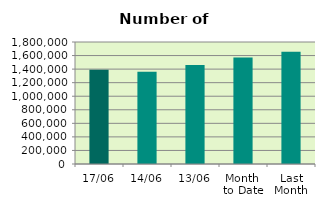
| Category | Series 0 |
|---|---|
| 17/06 | 1389086 |
| 14/06 | 1362150 |
| 13/06 | 1459952 |
| Month 
to Date | 1570591.455 |
| Last
Month | 1656073.545 |